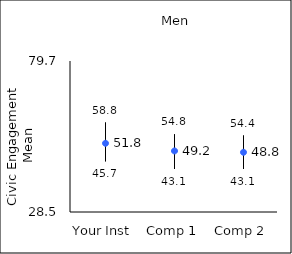
| Category | 25th percentile | 75th percentile | Mean |
|---|---|---|---|
| Your Inst | 45.7 | 58.8 | 51.8 |
| Comp 1 | 43.1 | 54.8 | 49.2 |
| Comp 2 | 43.1 | 54.4 | 48.75 |